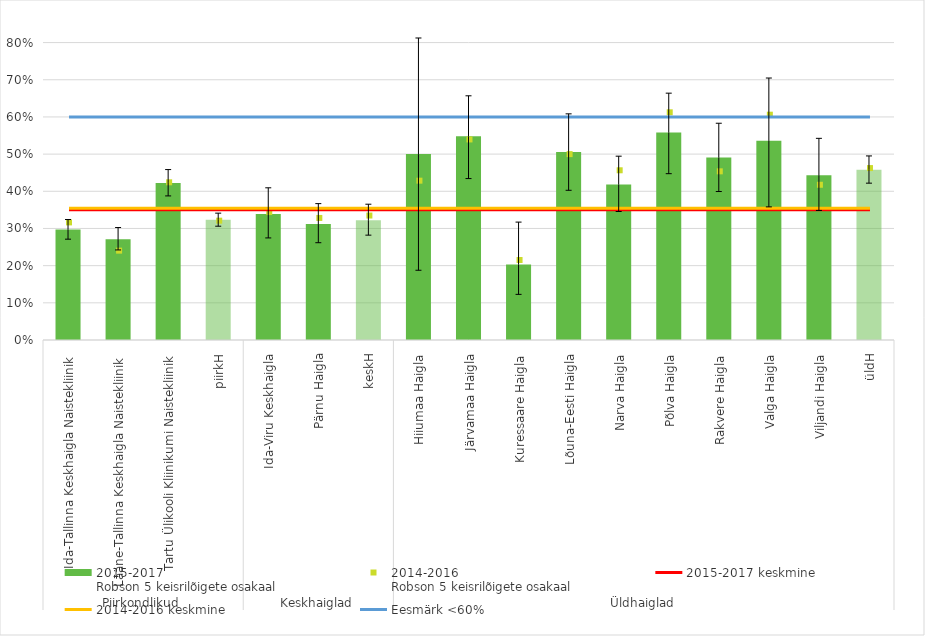
| Category | 2015-2017
Robson 5 keisrilõigete osakaal |
|---|---|
| 0 | 0.297 |
| 1 | 0.271 |
| 2 | 0.423 |
| 3 | 0.323 |
| 4 | 0.339 |
| 5 | 0.312 |
| 6 | 0.322 |
| 7 | 0.5 |
| 8 | 0.548 |
| 9 | 0.203 |
| 10 | 0.506 |
| 11 | 0.418 |
| 12 | 0.558 |
| 13 | 0.491 |
| 14 | 0.536 |
| 15 | 0.443 |
| 16 | 0.458 |